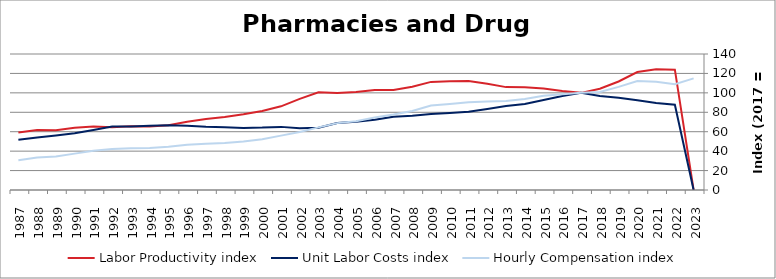
| Category | Labor Productivity index | Unit Labor Costs index | Hourly Compensation index |
|---|---|---|---|
| 2023.0 | 0 | 0 | 114.944 |
| 2022.0 | 123.88 | 87.815 | 108.785 |
| 2021.0 | 124.392 | 89.489 | 111.317 |
| 2020.0 | 121.44 | 92.453 | 112.274 |
| 2019.0 | 111.711 | 95.033 | 106.162 |
| 2018.0 | 104.284 | 96.674 | 100.815 |
| 2017.0 | 100 | 100 | 100 |
| 2016.0 | 101.82 | 96.847 | 98.609 |
| 2015.0 | 104.554 | 92.697 | 96.918 |
| 2014.0 | 105.776 | 88.519 | 93.632 |
| 2013.0 | 105.906 | 86.416 | 91.519 |
| 2012.0 | 109.379 | 83.304 | 91.117 |
| 2011.0 | 112.137 | 80.523 | 90.297 |
| 2010.0 | 111.887 | 79.185 | 88.597 |
| 2009.0 | 111.288 | 78.237 | 87.068 |
| 2008.0 | 106.208 | 76.523 | 81.273 |
| 2007.0 | 102.932 | 75.458 | 77.67 |
| 2006.0 | 103.036 | 72.371 | 74.568 |
| 2005.0 | 100.969 | 70.158 | 70.838 |
| 2004.0 | 99.78 | 68.991 | 68.839 |
| 2003.0 | 100.629 | 64.076 | 64.48 |
| 2002.0 | 93.813 | 63.585 | 59.65 |
| 2001.0 | 86.122 | 64.979 | 55.961 |
| 2000.0 | 81.261 | 64.234 | 52.197 |
| 1999.0 | 77.927 | 63.939 | 49.826 |
| 1998.0 | 75.185 | 64.48 | 48.479 |
| 1997.0 | 73.18 | 65.097 | 47.638 |
| 1996.0 | 70.299 | 66.184 | 46.526 |
| 1995.0 | 66.685 | 66.582 | 44.4 |
| 1994.0 | 65.413 | 66.087 | 43.229 |
| 1993.0 | 65.6 | 65.328 | 42.855 |
| 1992.0 | 64.631 | 65.35 | 42.236 |
| 1991.0 | 65.248 | 61.765 | 40.301 |
| 1990.0 | 64.022 | 58.474 | 37.436 |
| 1989.0 | 61.485 | 56.137 | 34.516 |
| 1988.0 | 61.658 | 54.136 | 33.379 |
| 1987.0 | 59.232 | 51.68 | 30.611 |